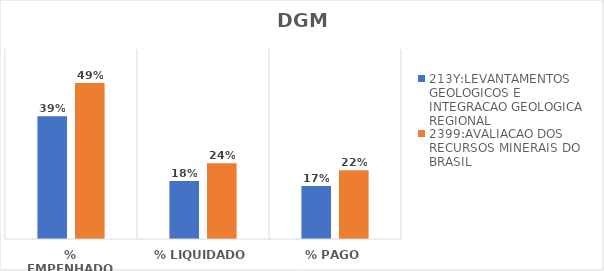
| Category | 213Y:LEVANTAMENTOS GEOLOGICOS E INTEGRACAO GEOLOGICA REGIONAL | 2399:AVALIACAO DOS RECURSOS MINERAIS DO BRASIL |
|---|---|---|
| % EMPENHADO | 0.388 | 0.493 |
| % LIQUIDADO | 0.184 | 0.239 |
| % PAGO | 0.168 | 0.217 |